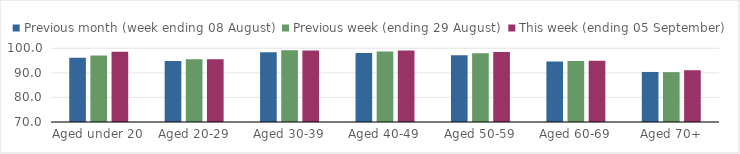
| Category | Previous month (week ending 08 August) | Previous week (ending 29 August) | This week (ending 05 September) |
|---|---|---|---|
| Aged under 20 | 96.18 | 97.02 | 98.57 |
| Aged 20-29 | 94.87 | 95.56 | 95.5 |
| Aged 30-39 | 98.43 | 99.15 | 99.13 |
| Aged 40-49 | 98.06 | 98.68 | 99.09 |
| Aged 50-59 | 97.2 | 98.03 | 98.45 |
| Aged 60-69 | 94.64 | 94.78 | 94.95 |
| Aged 70+ | 90.37 | 90.29 | 91.04 |